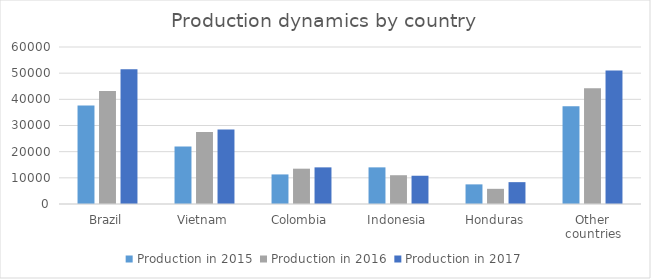
| Category | Production in 2015 | Production in 2016 | Production in 2017 |
|---|---|---|---|
| {{prod.country}} | 0 | 0 | 0 |